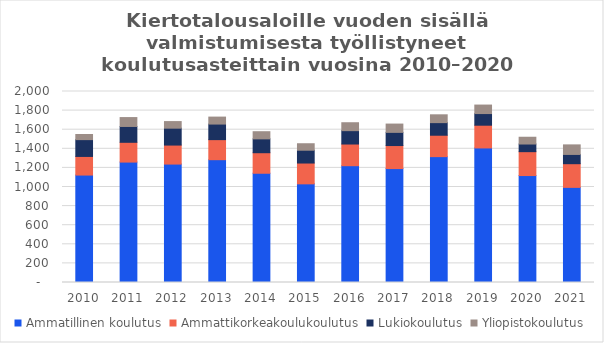
| Category | Ammatillinen koulutus | Ammattikorkeakoulukoulutus | Lukiokoulutus | Yliopistokoulutus |
|---|---|---|---|---|
| 2010.0 | 1125 | 195 | 176 | 54 |
| 2011.0 | 1261 | 207 | 166 | 93 |
| 2012.0 | 1240 | 199 | 177 | 69 |
| 2013.0 | 1286 | 210 | 163 | 73 |
| 2014.0 | 1144 | 215 | 145 | 75 |
| 2015.0 | 1033 | 218 | 134 | 68 |
| 2016.0 | 1223 | 227 | 140 | 83 |
| 2017.0 | 1193 | 241 | 138 | 87 |
| 2018.0 | 1318 | 224 | 132 | 82 |
| 2019.0 | 1409 | 238 | 122 | 89 |
| 2020.0 | 1120 | 250 | 80 | 71 |
| 2021.0 | 996 | 248 | 97 | 100 |